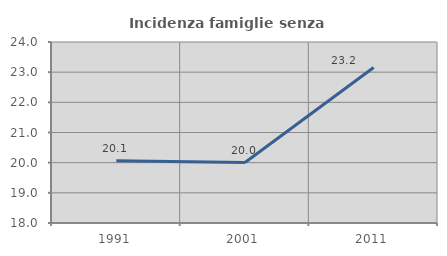
| Category | Incidenza famiglie senza nuclei |
|---|---|
| 1991.0 | 20.063 |
| 2001.0 | 20.004 |
| 2011.0 | 23.157 |